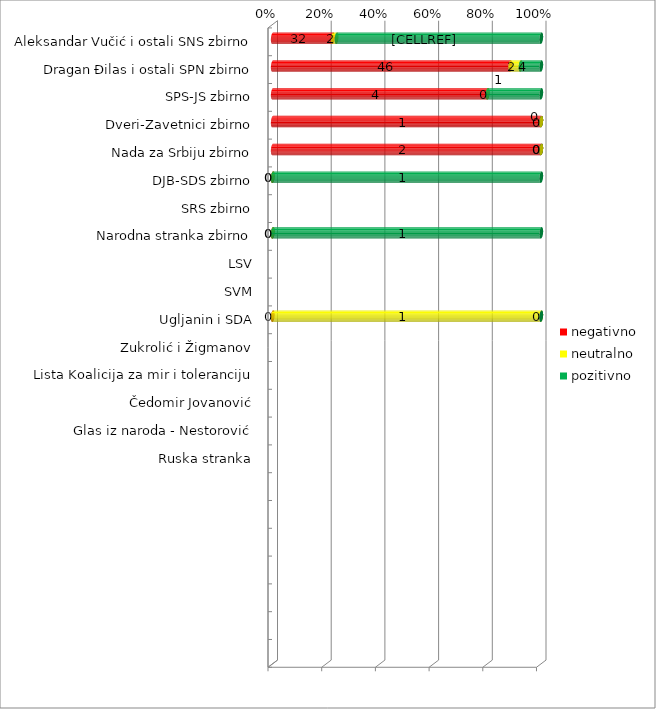
| Category | negativno | neutralno | pozitivno |
|---|---|---|---|
| Aleksandar Vučić i ostali SNS zbirno | 32 | 2 | 109 |
| Dragan Đilas i ostali SPN zbirno | 46 | 2 | 4 |
| SPS-JS zbirno | 4 | 0 | 1 |
| Dveri-Zavetnici zbirno | 1 | 0 | 0 |
| Nada za Srbiju zbirno | 2 | 0 | 0 |
| DJB-SDS zbirno | 0 | 0 | 1 |
| SRS zbirno | 0 | 0 | 0 |
| Narodna stranka zbirno | 0 | 0 | 1 |
| LSV | 0 | 0 | 0 |
| SVM | 0 | 0 | 0 |
| Ugljanin i SDA | 0 | 1 | 0 |
| Zukrolić i Žigmanov | 0 | 0 | 0 |
| Lista Koalicija za mir i toleranciju | 0 | 0 | 0 |
| Čedomir Jovanović | 0 | 0 | 0 |
| Glas iz naroda - Nestorović | 0 | 0 | 0 |
| Ruska stranka | 0 | 0 | 0 |